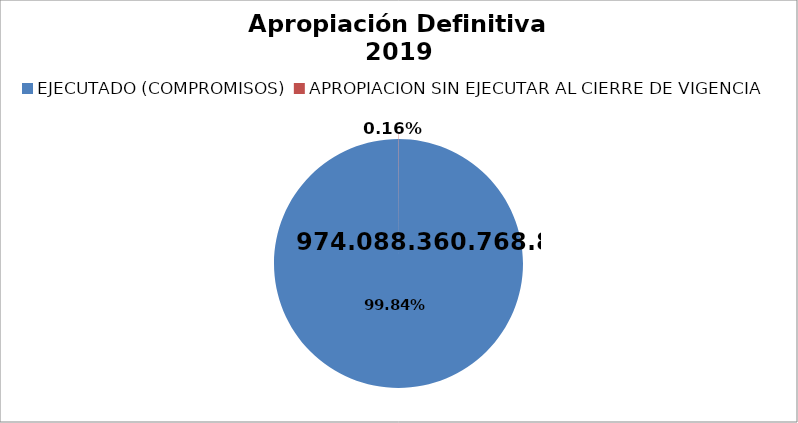
| Category | Apropiación Definitiva 2012 |  974,088,360,768.82  |
|---|---|---|
| EJECUTADO (COMPROMISOS) | 240389809806.9 |  |
| APROPIACION SIN EJECUTAR AL CIERRE DE VIGENCIA | 91057993.1 |  |